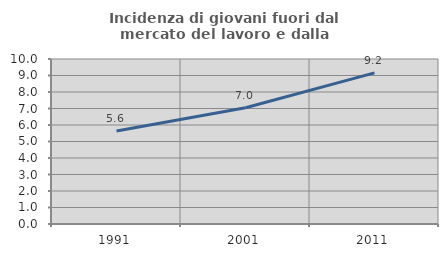
| Category | Incidenza di giovani fuori dal mercato del lavoro e dalla formazione  |
|---|---|
| 1991.0 | 5.639 |
| 2001.0 | 7.041 |
| 2011.0 | 9.157 |